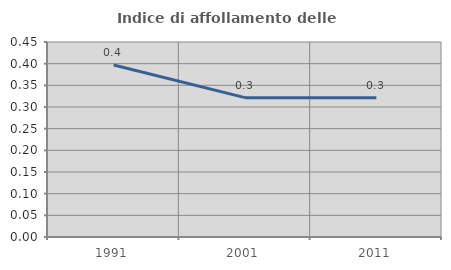
| Category | Indice di affollamento delle abitazioni  |
|---|---|
| 1991.0 | 0.397 |
| 2001.0 | 0.322 |
| 2011.0 | 0.322 |